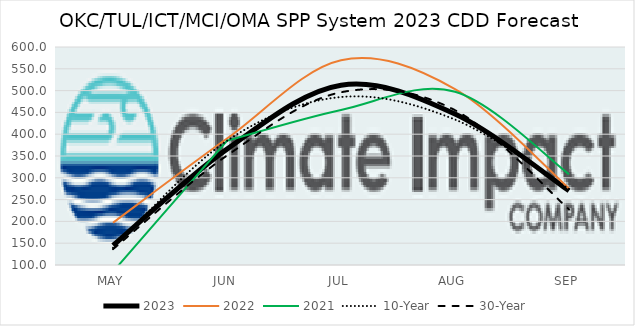
| Category | 2023 | 2022 | 2021 | 10-Year | 30-Year |
|---|---|---|---|---|---|
| MAY | 145 | 197 | 84.8 | 139.48 | 136.367 |
| JUN | 365.8 | 390 | 385 | 384.98 | 351.073 |
| JUL | 512.4 | 569.6 | 455.6 | 485.28 | 496.147 |
| AUG | 446.4 | 503.6 | 497.2 | 433.54 | 455.08 |
| SEP | 270.4 | 275.6 | 308.2 | 274.44 | 227.607 |